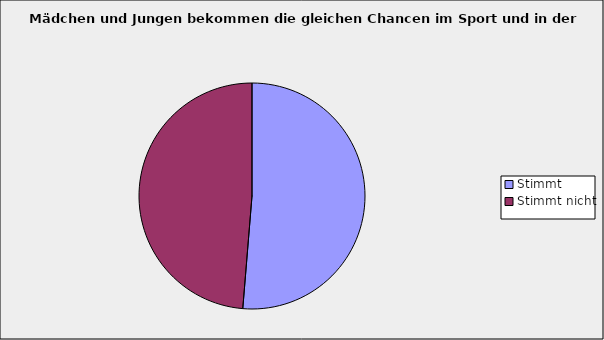
| Category | Series 0 |
|---|---|
| Stimmt | 0.513 |
| Stimmt nicht | 0.487 |